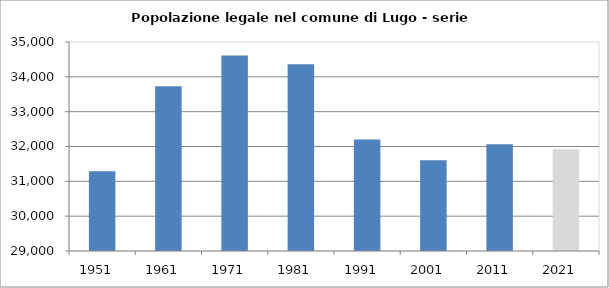
| Category | Popolazione residente |
|---|---|
| 1951   | 31292 |
| 1961   | 33731 |
| 1971   | 34611 |
| 1981   | 34359 |
| 1991   | 32204 |
| 2001   | 31603 |
| 2011   | 32062 |
| 2021   | 31919 |